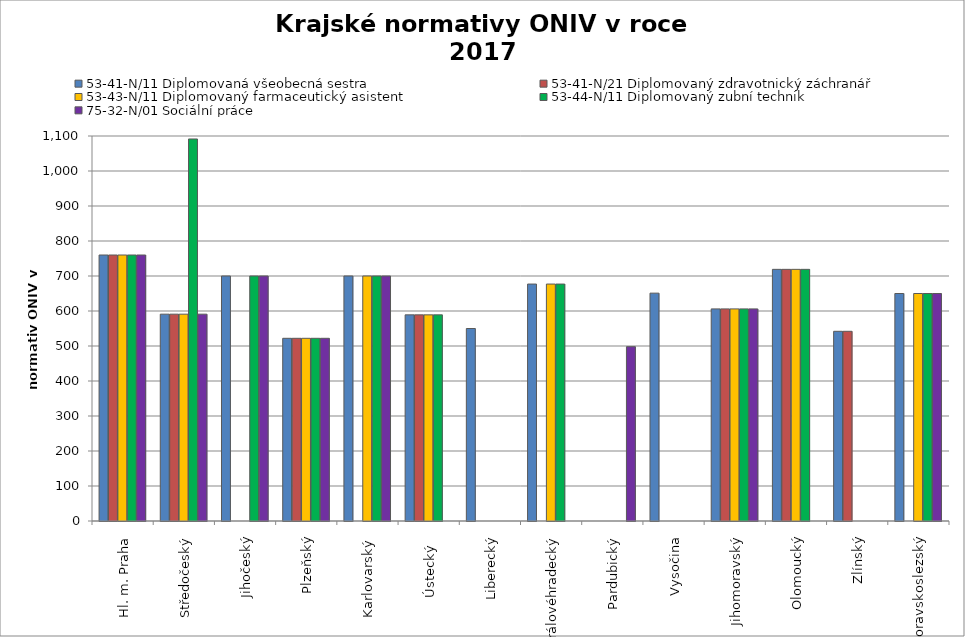
| Category | 53-41-N/11 Diplomovaná všeobecná sestra | 53-41-N/21 Diplomovaný zdravotnický záchranář | 53-43-N/11 Diplomovaný farmaceutický asistent | 53-44-N/11 Diplomovaný zubní technik | 75-32-N/01 Sociální práce |
|---|---|---|---|---|---|
| Hl. m. Praha | 760 | 760 | 760 | 760 | 760 |
| Středočeský | 590.94 | 590.94 | 590.94 | 1091.475 | 590.94 |
| Jihočeský | 700 | 0 | 0 | 700 | 700 |
| Plzeňský | 522 | 522 | 522 | 522 | 522 |
| Karlovarský  | 700 | 0 | 700 | 700 | 700 |
| Ústecký   | 589 | 589 | 589 | 589 | 0 |
| Liberecký | 550 | 0 | 0 | 0 | 0 |
| Královéhradecký | 677 | 0 | 677 | 677 | 0 |
| Pardubický | 0 | 0 | 0 | 0 | 498 |
| Vysočina | 651 | 0 | 0 | 0 | 0 |
| Jihomoravský | 606 | 606 | 606 | 606 | 606 |
| Olomoucký | 719 | 719 | 719 | 719 | 0 |
| Zlínský | 542 | 542 | 0 | 0 | 0 |
| Moravskoslezský | 650 | 0 | 650 | 650 | 650 |